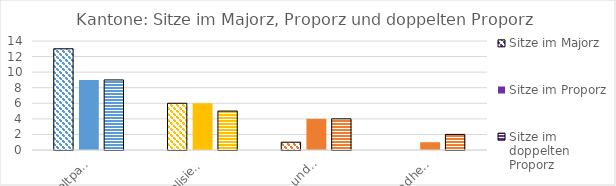
| Category | Sitze im Majorz | Sitze im Proporz | Sitze im doppelten Proporz |
|---|---|---|---|
| Umweltpartei | 13 | 9 | 9 |
| Digitalisierungspartei | 6 | 6 | 5 |
| Sport- und Kulturpartei | 1 | 4 | 4 |
| Gesundheitspartei | 0 | 1 | 2 |